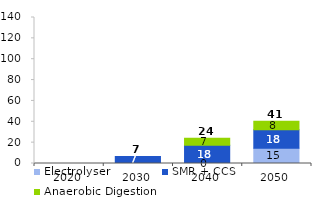
| Category | Electrolyser | SMR + CCS | Anaerobic Digestion | Series 3 |
|---|---|---|---|---|
| 2020.0 | 0 | 0 | 0 | 0 |
| 2030.0 | 0 | 6.819 | 0 | 6.819 |
| 2040.0 | 0 | 17.589 | 6.74 | 24.329 |
| 2050.0 | 14.659 | 17.589 | 8.26 | 40.508 |